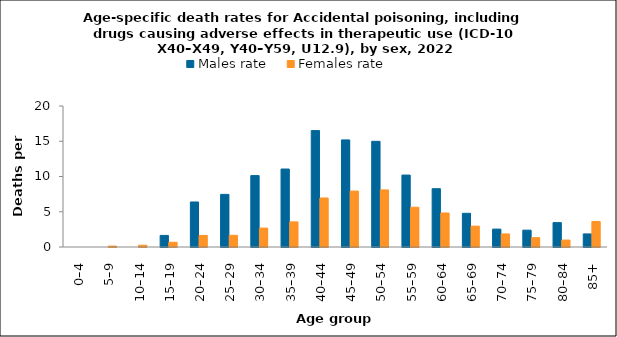
| Category | Males rate | Females rate |
|---|---|---|
| 0–4 | 0 | 0 |
| 5–9 | 0 | 0.128 |
| 10–14 | 0 | 0.251 |
| 15–19 | 1.644 | 0.673 |
| 20–24 | 6.383 | 1.642 |
| 25–29 | 7.463 | 1.662 |
| 30–34 | 10.131 | 2.686 |
| 35–39 | 11.06 | 3.563 |
| 40–44 | 16.513 | 6.952 |
| 45–49 | 15.191 | 7.933 |
| 50–54 | 14.989 | 8.097 |
| 55–59 | 10.205 | 5.639 |
| 60–64 | 8.27 | 4.825 |
| 65–69 | 4.782 | 2.96 |
| 70–74 | 2.54 | 1.853 |
| 75–79 | 2.389 | 1.321 |
| 80–84 | 3.458 | 0.983 |
| 85+ | 1.853 | 3.621 |